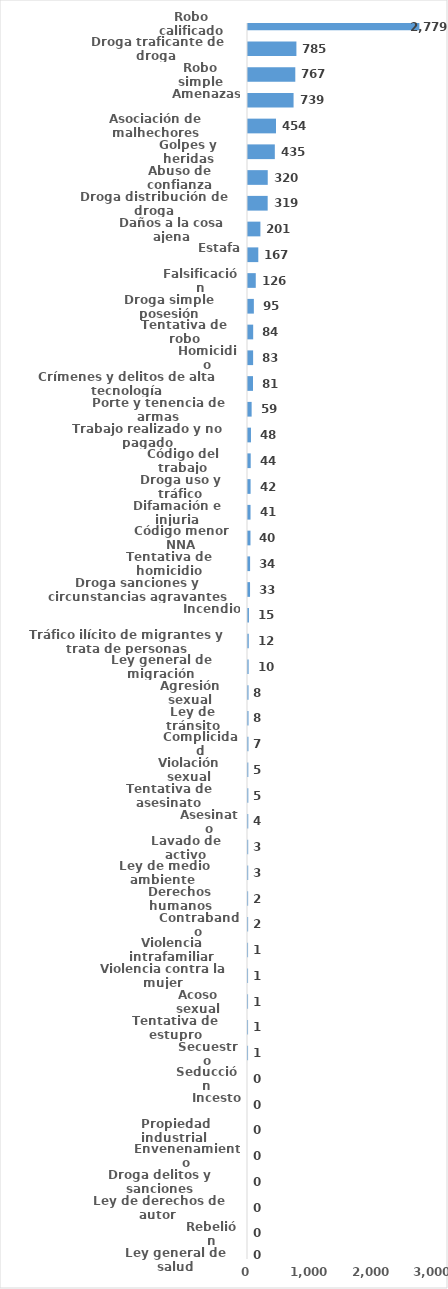
| Category | Series 0 |
|---|---|
| Robo calificado | 2779 |
| Droga traficante de droga  | 785 |
| Robo simple | 767 |
| Amenazas | 739 |
| Asociación de malhechores | 454 |
| Golpes y heridas | 435 |
| Abuso de confianza | 320 |
| Droga distribución de droga | 319 |
| Daños a la cosa ajena | 201 |
| Estafa | 167 |
| Falsificación | 126 |
| Droga simple posesión | 95 |
| Tentativa de robo | 84 |
| Homicidio | 83 |
| Crímenes y delitos de alta tecnología | 81 |
| Porte y tenencia de armas | 59 |
| Trabajo realizado y no pagado | 48 |
| Código del trabajo | 44 |
| Droga uso y tráfico | 42 |
| Difamación e injuria | 41 |
| Código menor NNA | 40 |
| Tentativa de homicidio | 34 |
| Droga sanciones y circunstancias agravantes | 33 |
| Incendio | 15 |
| Tráfico ilícito de migrantes y trata de personas | 12 |
| Ley general de migración | 10 |
| Agresión sexual | 8 |
| Ley de tránsito | 8 |
| Complicidad | 7 |
| Violación sexual | 5 |
| Tentativa de asesinato | 5 |
| Asesinato | 4 |
| Lavado de activo | 3 |
| Ley de medio ambiente  | 3 |
| Derechos humanos | 2 |
| Contrabando | 2 |
| Violencia intrafamiliar | 1 |
| Violencia contra la mujer | 1 |
| Acoso sexual | 1 |
| Tentativa de estupro | 1 |
| Secuestro | 1 |
| Seducción | 0 |
| Incesto | 0 |
| Propiedad industrial  | 0 |
| Envenenamiento | 0 |
| Droga delitos y sanciones | 0 |
| Ley de derechos de autor  | 0 |
| Rebelión | 0 |
| Ley general de salud | 0 |